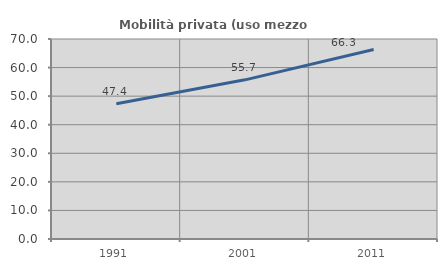
| Category | Mobilità privata (uso mezzo privato) |
|---|---|
| 1991.0 | 47.352 |
| 2001.0 | 55.705 |
| 2011.0 | 66.298 |